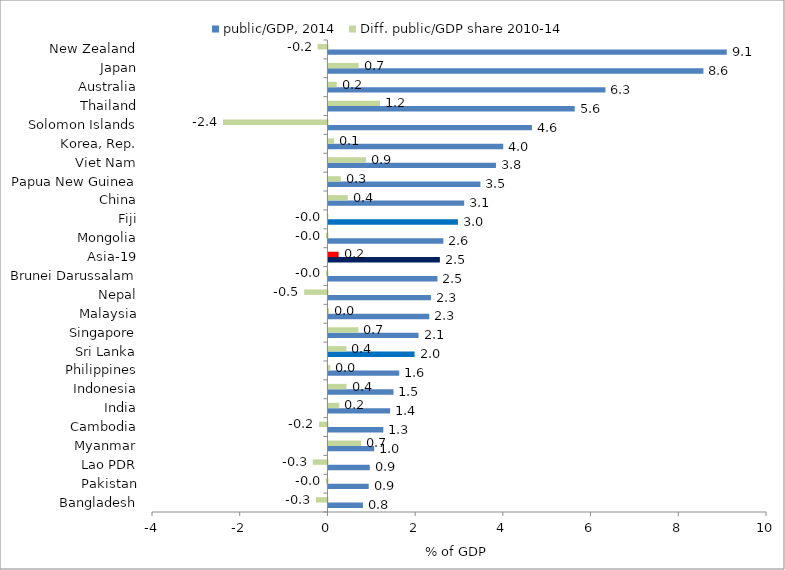
| Category | public/GDP, 2014 | Diff. public/GDP share 2010-14 |
|---|---|---|
| Bangladesh | 0.787 | -0.264 |
| Pakistan | 0.919 | -0.035 |
| Lao PDR | 0.943 | -0.335 |
| Myanmar | 1.045 | 0.746 |
| Cambodia | 1.251 | -0.19 |
| India | 1.407 | 0.246 |
| Indonesia | 1.483 | 0.413 |
| Philippines | 1.615 | 0.041 |
| Sri Lanka | 1.964 | 0.41 |
| Singapore | 2.055 | 0.683 |
| Malaysia | 2.3 | 0.014 |
| Nepal | 2.338 | -0.529 |
| Brunei Darussalam | 2.486 | -0.034 |
| Asia-19 | 2.541 | 0.233 |
| Mongolia | 2.621 | -0.034 |
| Fiji | 2.953 | -0.012 |
| China | 3.095 | 0.441 |
| Papua New Guinea | 3.466 | 0.282 |
| Viet Nam | 3.82 | 0.859 |
| Korea, Rep. | 3.985 | 0.13 |
| Solomon Islands | 4.64 | -2.382 |
| Thailand | 5.615 | 1.174 |
| Australia | 6.317 | 0.189 |
| Japan | 8.55 | 0.688 |
| New Zealand | 9.083 | -0.223 |